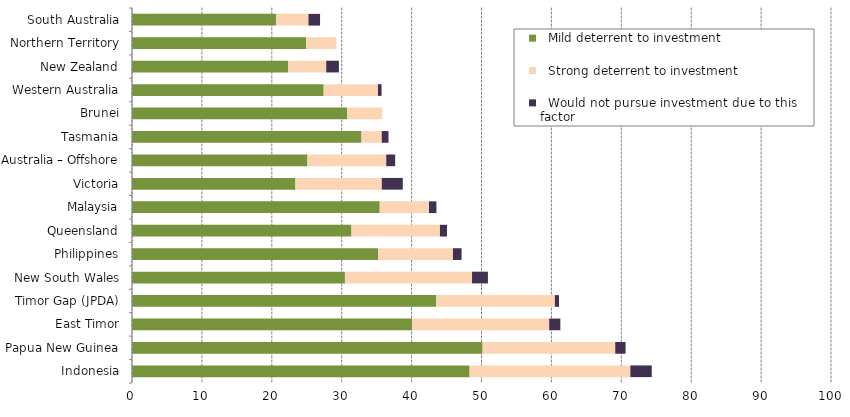
| Category |   Mild deterrent to investment |   Strong deterrent to investment |   Would not pursue investment due to this factor |
|---|---|---|---|
| Indonesia | 48.299 | 22.99 | 3.07 |
| Papua New Guinea | 50.157 | 18.974 | 1.485 |
| East Timor | 40.054 | 19.627 | 1.602 |
| Timor Gap (JPDA) | 43.51 | 16.987 | 0.596 |
| New South Wales | 30.46 | 18.185 | 2.273 |
| Philippines | 35.209 | 10.707 | 1.235 |
| Queensland | 31.395 | 12.659 | 1.013 |
| Malaysia | 35.439 | 7.049 | 1.062 |
| Victoria | 23.377 | 12.357 | 3.006 |
| Australia – Offshore | 25.1 | 11.272 | 1.278 |
| Tasmania | 32.832 | 2.897 | 0.966 |
| Brunei | 30.764 | 5.043 | 0 |
| Western Australia | 27.423 | 7.761 | 0.517 |
| New Zealand | 22.335 | 5.448 | 1.816 |
| Northern Territory | 24.914 | 4.333 | 0 |
| South Australia | 20.595 | 4.651 | 1.661 |